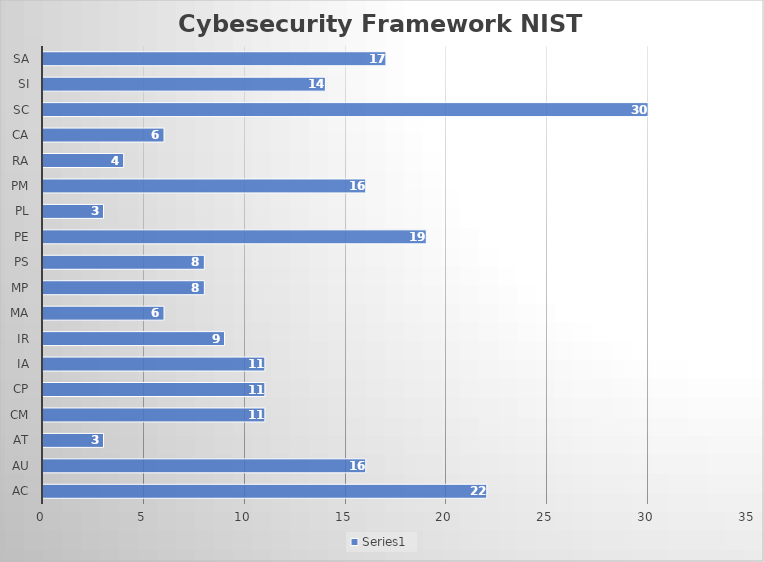
| Category | Series 0 |
|---|---|
| AC | 22 |
| AU | 16 |
| AT | 3 |
| CM | 11 |
| CP | 11 |
| IA | 11 |
| IR | 9 |
| MA | 6 |
| MP | 8 |
| PS | 8 |
| PE | 19 |
| PL | 3 |
| PM | 16 |
| RA | 4 |
| CA | 6 |
| SC | 30 |
| SI | 14 |
| SA | 17 |